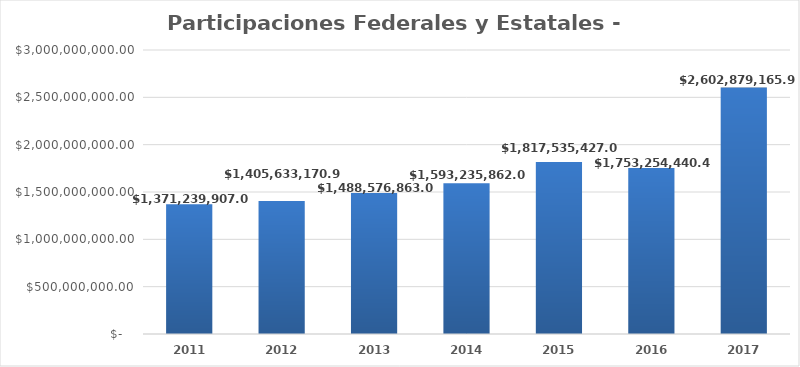
| Category | Participaciones Federales y Estatales - Ramo 28 |
|---|---|
| 2011.0 | 1371239907 |
| 2012.0 | 1405633170.9 |
| 2013.0 | 1488576863 |
| 2014.0 | 1593235862 |
| 2015.0 | 1817535427 |
| 2016.0 | 1753254440.43 |
| 2017.0 | 2602879165.99 |